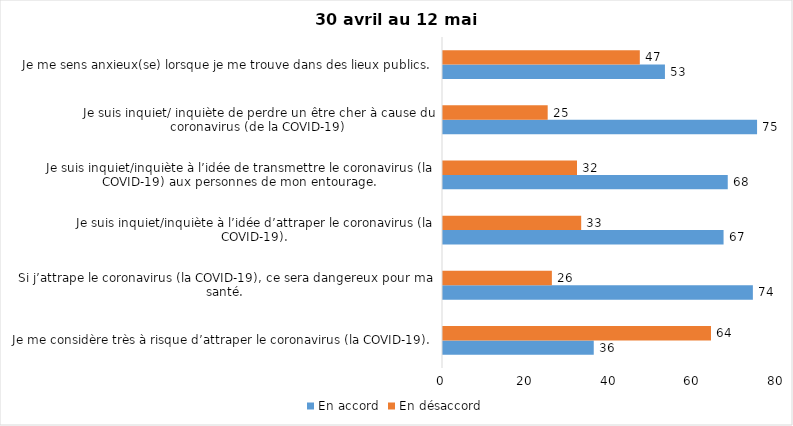
| Category | En accord | En désaccord |
|---|---|---|
| Je me considère très à risque d’attraper le coronavirus (la COVID-19). | 36 | 64 |
| Si j’attrape le coronavirus (la COVID-19), ce sera dangereux pour ma santé. | 74 | 26 |
| Je suis inquiet/inquiète à l’idée d’attraper le coronavirus (la COVID-19). | 67 | 33 |
| Je suis inquiet/inquiète à l’idée de transmettre le coronavirus (la COVID-19) aux personnes de mon entourage. | 68 | 32 |
| Je suis inquiet/ inquiète de perdre un être cher à cause du coronavirus (de la COVID-19) | 75 | 25 |
| Je me sens anxieux(se) lorsque je me trouve dans des lieux publics. | 53 | 47 |